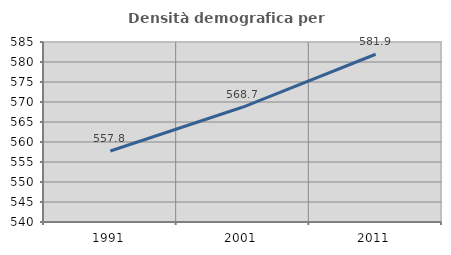
| Category | Densità demografica |
|---|---|
| 1991.0 | 557.76 |
| 2001.0 | 568.743 |
| 2011.0 | 581.937 |